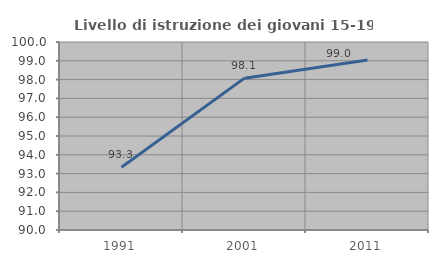
| Category | Livello di istruzione dei giovani 15-19 anni |
|---|---|
| 1991.0 | 93.333 |
| 2001.0 | 98.077 |
| 2011.0 | 99.038 |